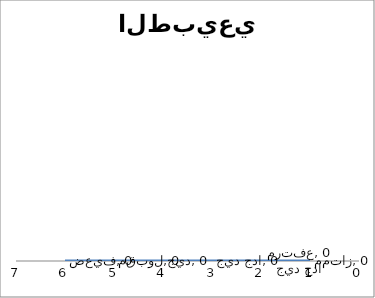
| Category | التكرار |
|---|---|
| 0 | 0 |
| 1 | 0 |
| 2 | 0 |
| 3 | 0 |
| 4 | 0 |
| 5 | 0 |